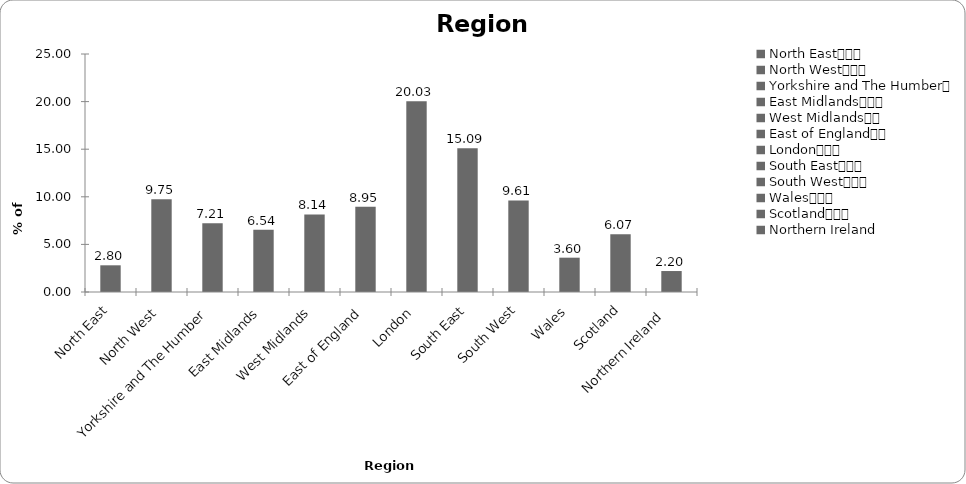
| Category | Region |
|---|---|
| North East			 | 2.804 |
| North West			 | 9.746 |
| Yorkshire and The Humber	 | 7.21 |
| East Midlands			 | 6.542 |
| West Midlands		 | 8.144 |
| East of England		 | 8.945 |
| London			 | 20.027 |
| South East			 | 15.087 |
| South West			 | 9.613 |
| Wales			 | 3.605 |
| Scotland			 | 6.075 |
| Northern Ireland  | 2.203 |